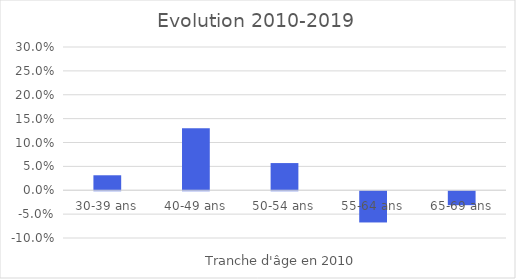
| Category | décennie 2010-2019 |
|---|---|
| 30-39 ans | 0.031 |
| 40-49 ans | 0.13 |
| 50-54 ans | 0.057 |
| 55-64 ans | -0.065 |
| 65-69 ans | -0.029 |